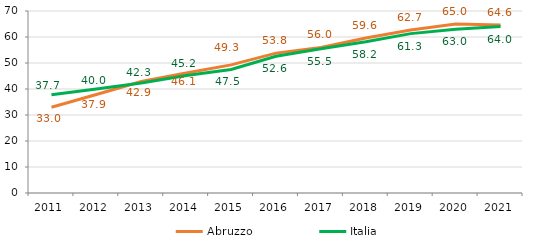
| Category | Abruzzo | Italia |
|---|---|---|
| 2011.0 | 32.975 | 37.749 |
| 2012.0 | 37.9 | 40 |
| 2013.0 | 42.89 | 42.299 |
| 2014.0 | 46.121 | 45.196 |
| 2015.0 | 49.27 | 47.489 |
| 2016.0 | 53.8 | 52.6 |
| 2017.0 | 56 | 55.5 |
| 2018.0 | 59.6 | 58.2 |
| 2019.0 | 62.7 | 61.3 |
| 2020.0 | 64.99 | 63 |
| 2021.0 | 64.6 | 64 |